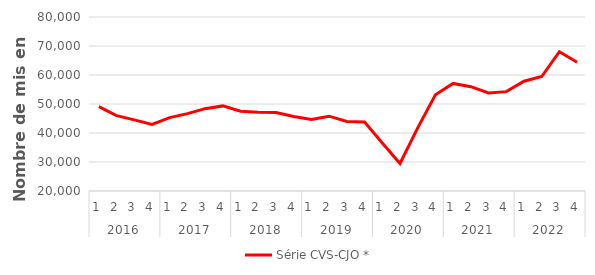
| Category | Série CVS-CJO * |
|---|---|
| 0 | 49074.771 |
| 1 | 46003.235 |
| 2 | 44534.393 |
| 3 | 42984.79 |
| 4 | 45307.176 |
| 5 | 46687.271 |
| 6 | 48397.682 |
| 7 | 49343.626 |
| 8 | 47510.899 |
| 9 | 47168.789 |
| 10 | 47089.284 |
| 11 | 45719.374 |
| 12 | 44687.174 |
| 13 | 45798.686 |
| 14 | 43992.029 |
| 15 | 43818.903 |
| 16 | 36577.52 |
| 17 | 29487.53 |
| 18 | 41769.922 |
| 19 | 53206.226 |
| 20 | 57091.286 |
| 21 | 55962.42 |
| 22 | 53814.333 |
| 23 | 54262.43 |
| 24 | 57846.871 |
| 25 | 59469.976 |
| 26 | 68033.949 |
| 27 | 64400.166 |